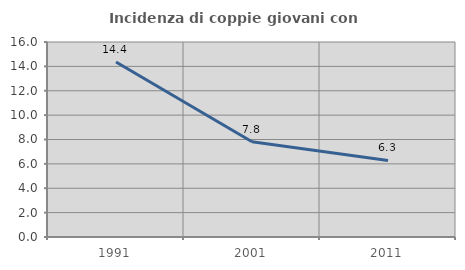
| Category | Incidenza di coppie giovani con figli |
|---|---|
| 1991.0 | 14.362 |
| 2001.0 | 7.821 |
| 2011.0 | 6.283 |